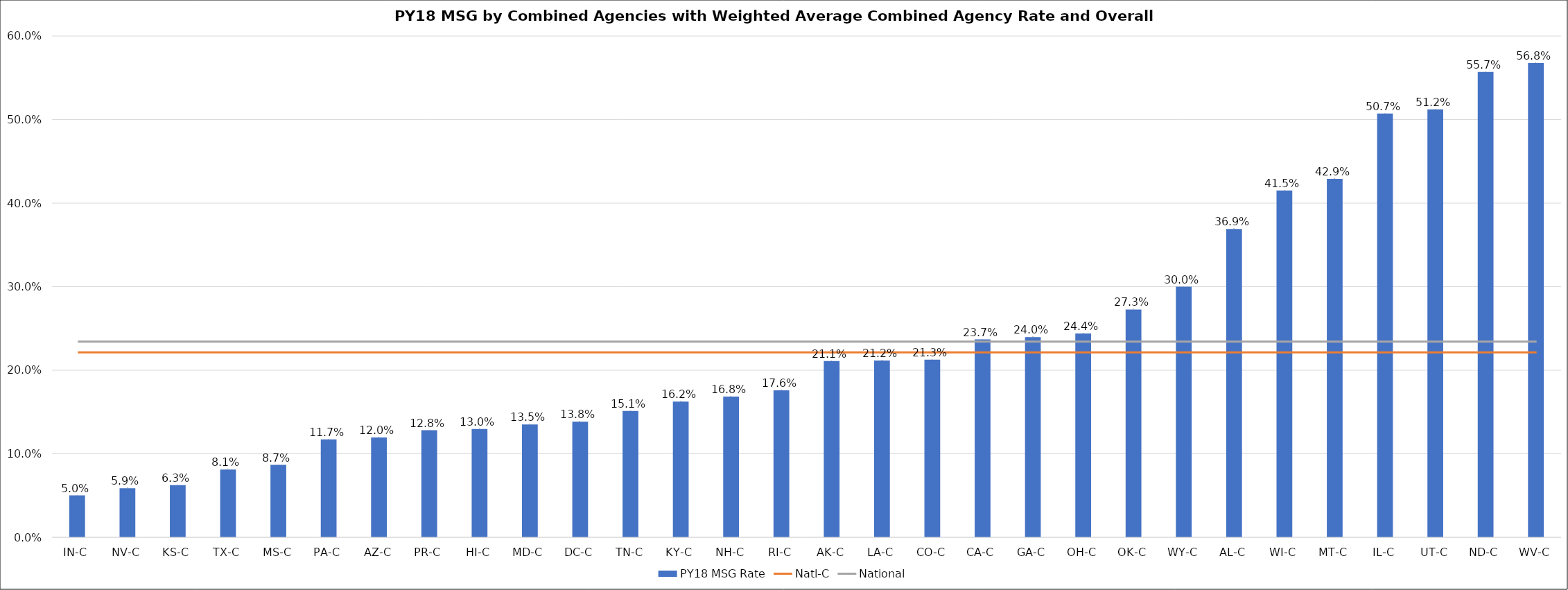
| Category | PY18 MSG Rate |
|---|---|
| IN-C | 0.05 |
| NV-C | 0.059 |
| KS-C | 0.062 |
| TX-C | 0.081 |
| MS-C | 0.087 |
| PA-C | 0.117 |
| AZ-C | 0.12 |
| PR-C | 0.128 |
| HI-C | 0.13 |
| MD-C | 0.135 |
| DC-C | 0.138 |
| TN-C | 0.151 |
| KY-C | 0.162 |
| NH-C | 0.168 |
| RI-C | 0.176 |
| AK-C | 0.211 |
| LA-C | 0.212 |
| CO-C | 0.213 |
| CA-C | 0.237 |
| GA-C | 0.24 |
| OH-C | 0.244 |
| OK-C | 0.273 |
| WY-C | 0.3 |
| AL-C | 0.369 |
| WI-C | 0.415 |
| MT-C | 0.429 |
| IL-C | 0.507 |
| UT-C | 0.512 |
| ND-C | 0.557 |
| WV-C | 0.568 |